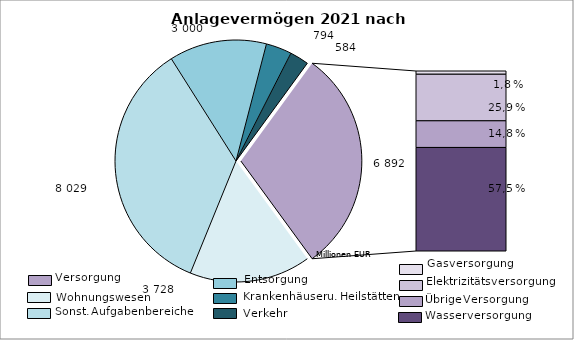
| Category | Series 0 |
|---|---|
| Wohnungsunternehmen | 3728 |
| sonstige Aufgabenbereiche | 8029 |
| Entsorgungsunternehmen | 3000 |
| Krankenhäuser | 794 |
| Verkehrsunternehmen | 584 |
| Gas | 124 |
| Elektrizität | 1783 |
| Kombinierte Unternehmen | 1021 |
| Wasser | 3965 |